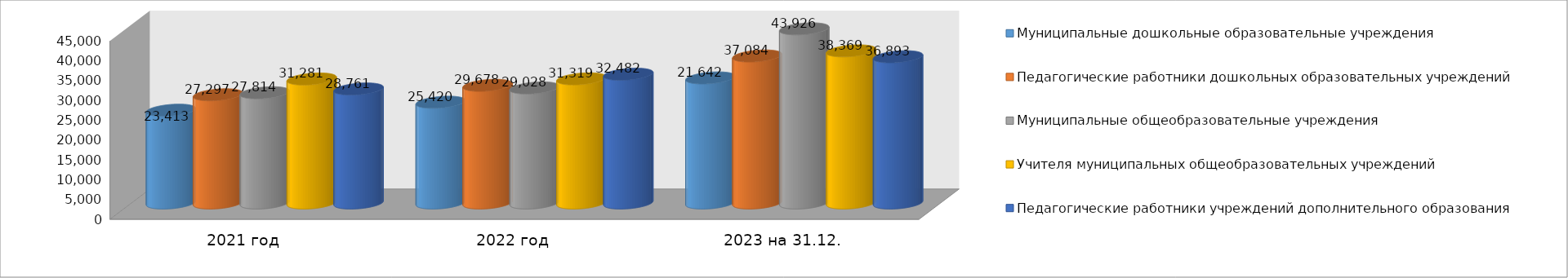
| Category | Муниципальные дошкольные образовательные учреждения | Педагогические работники дошкольных образовательных учреждений | Муниципальные общеобразовательные учреждения | Учителя муниципальных общеобразовательных учреждений | Педагогические работники учреждений дополнительного образования |
|---|---|---|---|---|---|
| 2021 год | 23413 | 27297 | 27814 | 31281 | 28761 |
| 2022 год | 25420 | 29678 | 29028 | 31319 | 32482 |
| 2023 на 31.12. | 31553 | 37084 | 43926 | 38369 | 36893 |